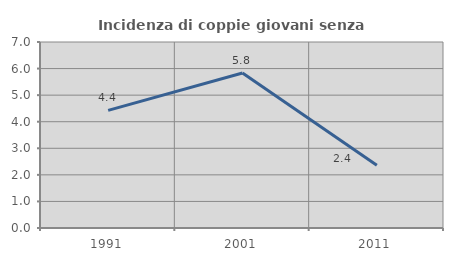
| Category | Incidenza di coppie giovani senza figli |
|---|---|
| 1991.0 | 4.425 |
| 2001.0 | 5.833 |
| 2011.0 | 2.362 |